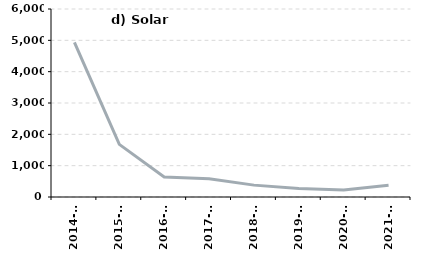
| Category | Solar Thermal |
|---|---|
| 2014-15 | 4937 |
| 2015-16 | 1680 |
| 2016-17 | 636 |
| 2017-18 | 583 |
| 2018-19 | 379 |
| 2019-20 | 272 |
| 2020-21 | 224 |
| 2021-22 | 376 |